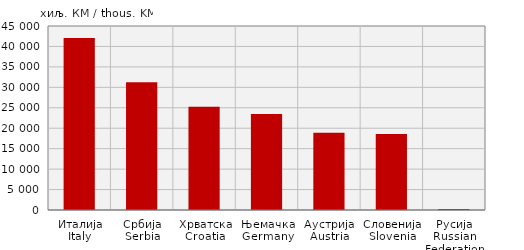
| Category | Извоз
Export |
|---|---|
| Италија
Italy | 42091 |
| Србија
Serbia | 31265 |
| Хрватска
Croatia | 25277 |
| Њемачка
Germany | 23500 |
| Аустрија
Austria | 18887 |
| Словенија
Slovenia | 18590 |
| Русија
Russian Federation | 238 |